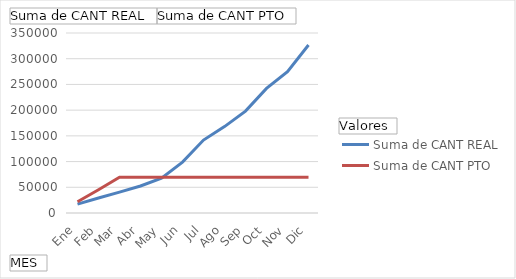
| Category | Suma de CANT REAL | Suma de CANT PTO |
|---|---|---|
| Ene | 17330 | 22000 |
| Feb | 29095 | 45200 |
| Mar | 40585 | 69600 |
| Abr | 52530 | 69600 |
| May | 67555 | 69600 |
| Jun | 99010 | 69600 |
| Jul | 141800 | 69600 |
| Ago | 167970 | 69600 |
| Sep | 198120 | 69600 |
| Oct | 242280 | 69600 |
| Nov | 274875 | 69600 |
| Dic | 326765 | 69600 |